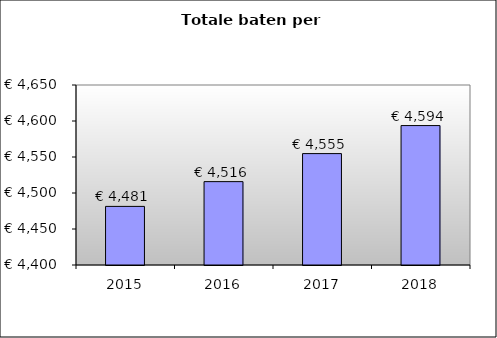
| Category | Series 0 |
|---|---|
| 2015.0 | 4481.397 |
| 2016.0 | 4515.796 |
| 2017.0 | 4554.719 |
| 2018.0 | 4593.642 |